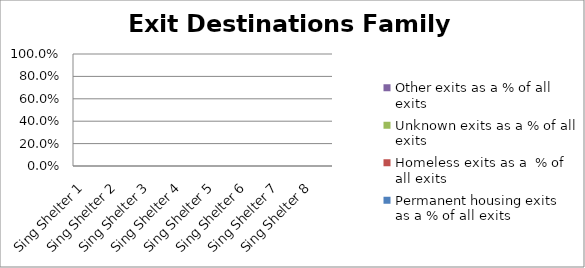
| Category | Permanent housing exits as a % of all exits | Homeless exits as a  % of all exits | Unknown exits as a % of all exits | Other exits as a % of all exits |
|---|---|---|---|---|
| Sing Shelter 1 | 0 | 0 | 0 | 0 |
| Sing Shelter 2 | 0 | 0 | 0 | 0 |
| Sing Shelter 3 | 0 | 0 | 0 | 0 |
| Sing Shelter 4 | 0 | 0 | 0 | 0 |
| Sing Shelter 5 | 0 | 0 | 0 | 0 |
| Sing Shelter 6 | 0 | 0 | 0 | 0 |
| Sing Shelter 7 | 0 | 0 | 0 | 0 |
| Sing Shelter 8 | 0 | 0 | 0 | 0 |